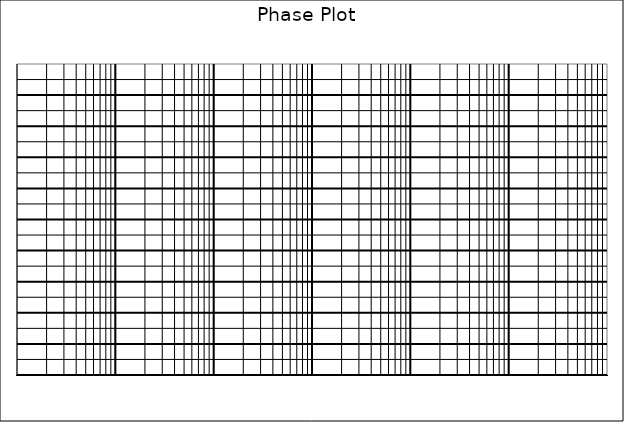
| Category | Series 0 |
|---|---|
| 0.001 | 90 |
| 0.002 | 90 |
| 0.005 | 90 |
| 0.01 | 90 |
| 0.02 | 90 |
| 0.05 | 90 |
| 0.1 | 90 |
| 0.2 | 90 |
| 0.5 | 90 |
| 1.0 | 90 |
| 2.0 | 90 |
| 5.0 | 90 |
| 10.0 | 90 |
| 20.0 | 90 |
| 50.0 | 90 |
| 100.0 | 90 |
| 200.0 | 90 |
| 500.0 | 90 |
| 1000.0 | 90 |
| 2000.0 | 90 |
| 5000.0 | 90 |
| 10000.0 | 90 |
| 20000.0 | 90 |
| 50000.0 | 90 |
| 100000.0 | 90 |
| 200000.0 | 90 |
| 500000.0 | 90 |
| 1000000.0 | 90 |
| 2000000.0 | 90 |
| 5000000.0 | 90 |
| 10000000.0 | 90 |